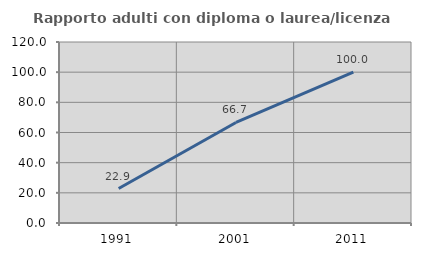
| Category | Rapporto adulti con diploma o laurea/licenza media  |
|---|---|
| 1991.0 | 22.857 |
| 2001.0 | 66.667 |
| 2011.0 | 100 |